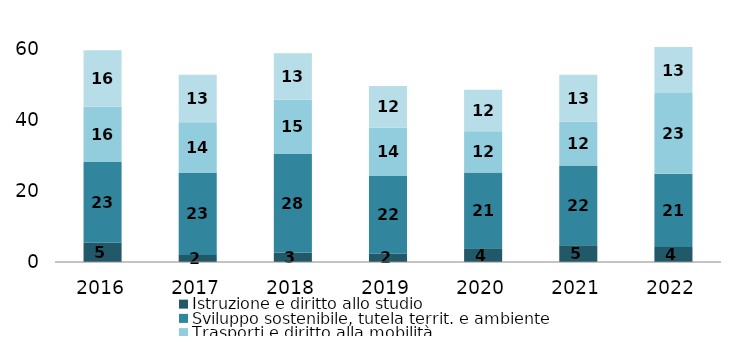
| Category | Istruzione e diritto allo studio | Sviluppo sostenibile, tutela territ. e ambiente | Trasporti e diritto alla mobilità | Diritti sociali, politiche sociali e famiglia |
|---|---|---|---|---|
| 2016.0 | 5.419 | 22.802 | 15.62 | 15.927 |
| 2017.0 | 1.989 | 23.164 | 14.305 | 13.424 |
| 2018.0 | 2.708 | 27.802 | 15.261 | 13.119 |
| 2019.0 | 2.302 | 21.998 | 13.692 | 11.699 |
| 2020.0 | 3.909 | 21.373 | 11.628 | 11.739 |
| 2021.0 | 4.733 | 22.47 | 12.402 | 13.215 |
| 2022.0 | 4.219 | 20.68 | 22.768 | 12.985 |